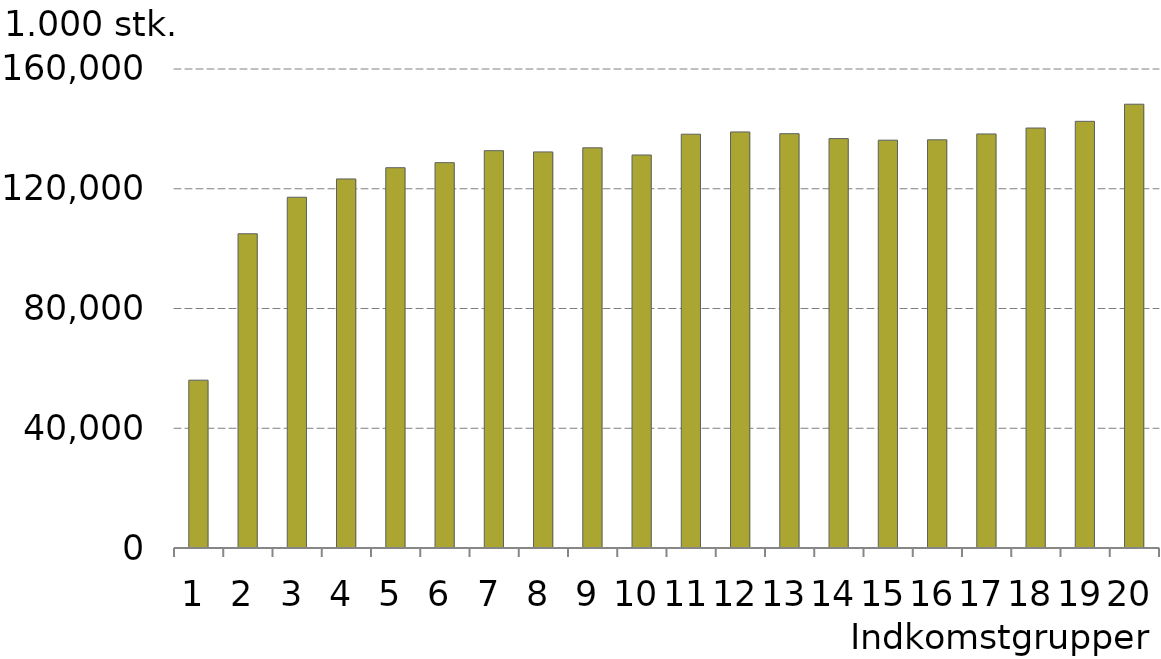
| Category |  Indkomstgrupper |
|---|---|
| 0 | 56057.742 |
| 1 | 104959.305 |
| 2 | 117167.883 |
| 3 | 123273.352 |
| 4 | 127028.188 |
| 5 | 128713.938 |
| 6 | 132715.25 |
| 7 | 132299.438 |
| 8 | 133673.438 |
| 9 | 131268.875 |
| 10 | 138225.094 |
| 11 | 138971.875 |
| 12 | 138397.703 |
| 13 | 136748.719 |
| 14 | 136224.719 |
| 15 | 136341.594 |
| 16 | 138303.234 |
| 17 | 140283.734 |
| 18 | 142522.359 |
| 19 | 148236.406 |